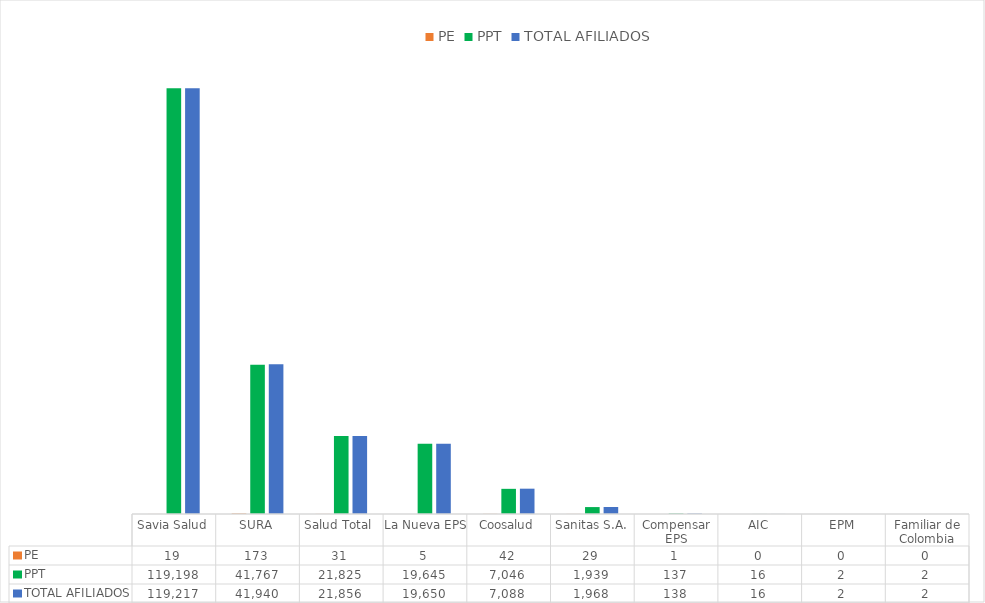
| Category | PE | PPT | TOTAL AFILIADOS |
|---|---|---|---|
| Savia Salud | 19 | 119198 | 119217 |
| SURA | 173 | 41767 | 41940 |
| Salud Total  | 31 | 21825 | 21856 |
| La Nueva EPS | 5 | 19645 | 19650 |
| Coosalud | 42 | 7046 | 7088 |
| Sanitas S.A. | 29 | 1939 | 1968 |
| Compensar EPS | 1 | 137 | 138 |
| AIC | 0 | 16 | 16 |
| EPM | 0 | 2 | 2 |
| Familiar de Colombia | 0 | 2 | 2 |